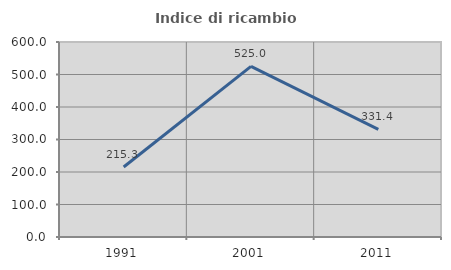
| Category | Indice di ricambio occupazionale  |
|---|---|
| 1991.0 | 215.254 |
| 2001.0 | 525 |
| 2011.0 | 331.429 |